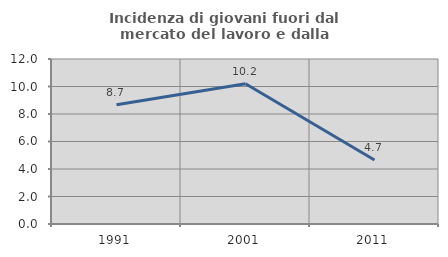
| Category | Incidenza di giovani fuori dal mercato del lavoro e dalla formazione  |
|---|---|
| 1991.0 | 8.667 |
| 2001.0 | 10.204 |
| 2011.0 | 4.651 |